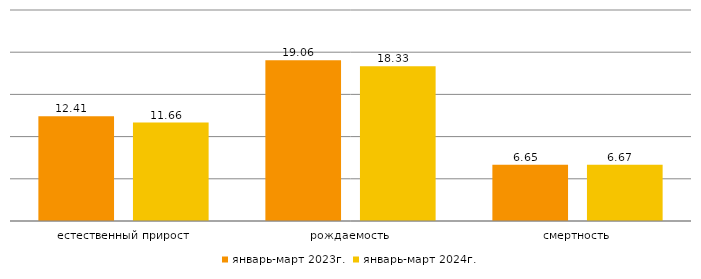
| Category | январь-март 2023г. | январь-март 2024г. |
|---|---|---|
| естественный прирост | 12.41 | 11.66 |
| рождаемость | 19.06 | 18.33 |
| смертность | 6.65 | 6.67 |